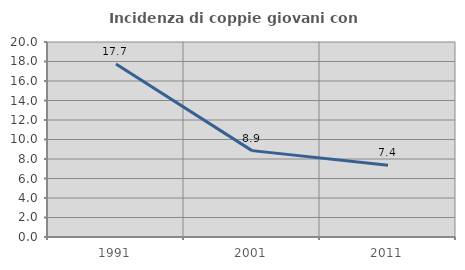
| Category | Incidenza di coppie giovani con figli |
|---|---|
| 1991.0 | 17.74 |
| 2001.0 | 8.859 |
| 2011.0 | 7.368 |